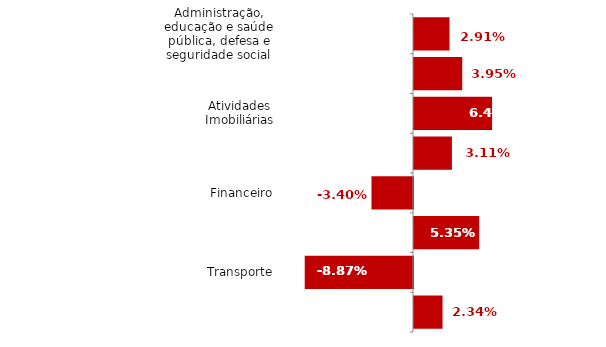
| Category | Series 0 |
|---|---|
| Administração, educação e saúde pública, defesa e seguridade social | 0.029 |
| Comércio | 0.04 |
| Atividades Imobiliárias | 0.064 |
| Atividades profissionais, científicas e técnicas, administrativas e serviços complementares | 0.031 |
| Financeiro | -0.034 |
| Alojamento e alimentação | 0.053 |
| Transporte | -0.089 |
| Artes, cultura, esporte e recreação e outros serviços | 0.023 |